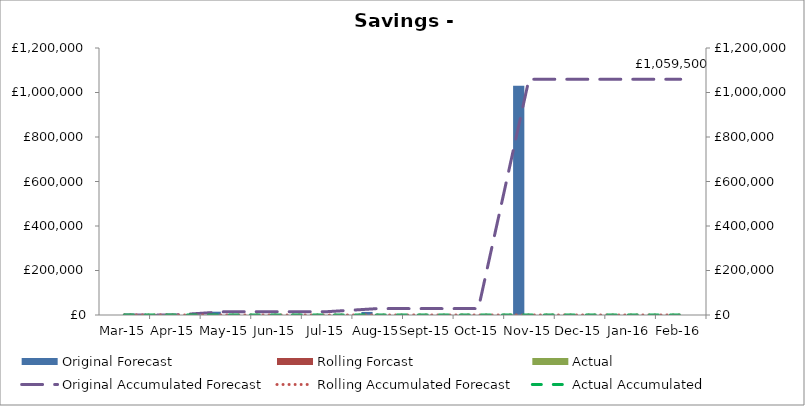
| Category | Original Forecast | Rolling Forcast | Actual |
|---|---|---|---|
| 2015-03-01 | 0 | 0 | 0 |
| 2015-04-01 | 0 | 0 | 0 |
| 2015-05-01 | 14833.33 | 0 | 0 |
| 2015-06-01 | 0 | 0 | 0 |
| 2015-07-01 | 0 | 0 | 0 |
| 2015-08-01 | 13833.33 | 0 | 0 |
| 2015-09-01 | 0 | 0 | 0 |
| 2015-10-01 | 0 | 0 | 0 |
| 2015-11-01 | 1030833.33 | 0 | 0 |
| 2015-12-01 | 0 | 0 | 0 |
| 2016-01-01 | 0 | 0 | 0 |
| 2016-02-01 | 0 | 0 | 0 |